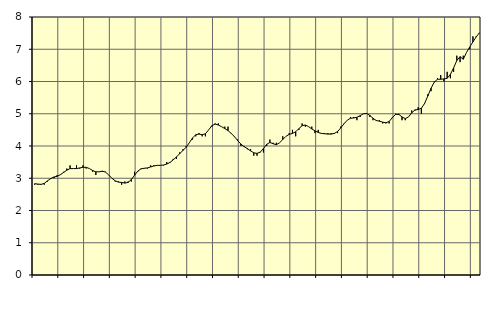
| Category | Piggar | Information och kommunikation, SNI 58-631 |
|---|---|---|
| nan | 2.8 | 2.83 |
| 87.0 | 2.8 | 2.82 |
| 87.0 | 2.8 | 2.81 |
| 87.0 | 2.8 | 2.84 |
| nan | 2.9 | 2.92 |
| 88.0 | 3 | 2.99 |
| 88.0 | 3 | 3.04 |
| 88.0 | 3.1 | 3.06 |
| nan | 3.1 | 3.11 |
| 89.0 | 3.2 | 3.18 |
| 89.0 | 3.3 | 3.25 |
| 89.0 | 3.4 | 3.3 |
| nan | 3.3 | 3.3 |
| 90.0 | 3.4 | 3.3 |
| 90.0 | 3.3 | 3.32 |
| 90.0 | 3.4 | 3.34 |
| nan | 3.3 | 3.34 |
| 91.0 | 3.3 | 3.3 |
| 91.0 | 3.2 | 3.24 |
| 91.0 | 3.1 | 3.2 |
| nan | 3.2 | 3.2 |
| 92.0 | 3.2 | 3.22 |
| 92.0 | 3.2 | 3.19 |
| 92.0 | 3.1 | 3.1 |
| nan | 3 | 3 |
| 93.0 | 2.9 | 2.92 |
| 93.0 | 2.9 | 2.88 |
| 93.0 | 2.8 | 2.87 |
| nan | 2.9 | 2.85 |
| 94.0 | 2.9 | 2.87 |
| 94.0 | 2.9 | 2.96 |
| 94.0 | 3.2 | 3.09 |
| nan | 3.2 | 3.22 |
| 95.0 | 3.3 | 3.29 |
| 95.0 | 3.3 | 3.31 |
| 95.0 | 3.3 | 3.32 |
| nan | 3.4 | 3.35 |
| 96.0 | 3.4 | 3.38 |
| 96.0 | 3.4 | 3.4 |
| 96.0 | 3.4 | 3.4 |
| nan | 3.4 | 3.41 |
| 97.0 | 3.5 | 3.44 |
| 97.0 | 3.5 | 3.49 |
| 97.0 | 3.6 | 3.57 |
| nan | 3.6 | 3.66 |
| 98.0 | 3.8 | 3.76 |
| 98.0 | 3.9 | 3.86 |
| 98.0 | 4 | 3.96 |
| nan | 4.1 | 4.1 |
| 99.0 | 4.2 | 4.25 |
| 99.0 | 4.3 | 4.35 |
| 99.0 | 4.4 | 4.37 |
| nan | 4.3 | 4.35 |
| 0.0 | 4.3 | 4.38 |
| 0.0 | 4.5 | 4.5 |
| 0.0 | 4.6 | 4.63 |
| nan | 4.7 | 4.68 |
| 1.0 | 4.7 | 4.65 |
| 1.0 | 4.6 | 4.6 |
| 1.0 | 4.6 | 4.54 |
| nan | 4.6 | 4.48 |
| 2.0 | 4.4 | 4.39 |
| 2.0 | 4.3 | 4.29 |
| 2.0 | 4.2 | 4.17 |
| nan | 4 | 4.06 |
| 3.0 | 4 | 3.98 |
| 3.0 | 3.9 | 3.92 |
| 3.0 | 3.9 | 3.85 |
| nan | 3.7 | 3.79 |
| 4.0 | 3.7 | 3.77 |
| 4.0 | 3.8 | 3.81 |
| 4.0 | 3.8 | 3.92 |
| nan | 4 | 4.05 |
| 5.0 | 4.2 | 4.11 |
| 5.0 | 4.1 | 4.07 |
| 5.0 | 4.1 | 4.04 |
| nan | 4.1 | 4.1 |
| 6.0 | 4.3 | 4.2 |
| 6.0 | 4.3 | 4.3 |
| 6.0 | 4.4 | 4.36 |
| nan | 4.5 | 4.39 |
| 7.0 | 4.3 | 4.44 |
| 7.0 | 4.5 | 4.54 |
| 7.0 | 4.7 | 4.63 |
| nan | 4.6 | 4.65 |
| 8.0 | 4.6 | 4.6 |
| 8.0 | 4.6 | 4.53 |
| 8.0 | 4.4 | 4.47 |
| nan | 4.5 | 4.42 |
| 9.0 | 4.4 | 4.39 |
| 9.0 | 4.4 | 4.38 |
| 9.0 | 4.4 | 4.37 |
| nan | 4.4 | 4.37 |
| 10.0 | 4.4 | 4.39 |
| 10.0 | 4.4 | 4.45 |
| 10.0 | 4.6 | 4.56 |
| nan | 4.7 | 4.69 |
| 11.0 | 4.8 | 4.8 |
| 11.0 | 4.9 | 4.86 |
| 11.0 | 4.9 | 4.87 |
| nan | 4.8 | 4.89 |
| 12.0 | 4.9 | 4.94 |
| 12.0 | 5 | 5 |
| 12.0 | 5 | 5.01 |
| nan | 4.9 | 4.95 |
| 13.0 | 4.8 | 4.86 |
| 13.0 | 4.8 | 4.79 |
| 13.0 | 4.8 | 4.77 |
| nan | 4.7 | 4.74 |
| 14.0 | 4.7 | 4.72 |
| 14.0 | 4.7 | 4.76 |
| 14.0 | 4.9 | 4.88 |
| nan | 5 | 4.98 |
| 15.0 | 5 | 4.98 |
| 15.0 | 4.8 | 4.9 |
| 15.0 | 4.8 | 4.85 |
| nan | 4.9 | 4.9 |
| 16.0 | 5.1 | 5.03 |
| 16.0 | 5.1 | 5.12 |
| 16.0 | 5.2 | 5.13 |
| nan | 5 | 5.17 |
| 17.0 | 5.3 | 5.32 |
| 17.0 | 5.6 | 5.55 |
| 17.0 | 5.7 | 5.79 |
| nan | 6 | 5.98 |
| 18.0 | 6.1 | 6.07 |
| 18.0 | 6.2 | 6.07 |
| 18.0 | 6 | 6.08 |
| nan | 6.3 | 6.1 |
| 19.0 | 6.1 | 6.22 |
| 19.0 | 6.3 | 6.42 |
| 19.0 | 6.8 | 6.65 |
| nan | 6.6 | 6.77 |
| 20.0 | 6.8 | 6.69 |
| 20.0 | 6.9 | 6.9 |
| 20.0 | 7 | 7.07 |
| nan | 7.4 | 7.23 |
| 21.0 | 7.4 | 7.38 |
| 21.0 | 7.5 | 7.51 |